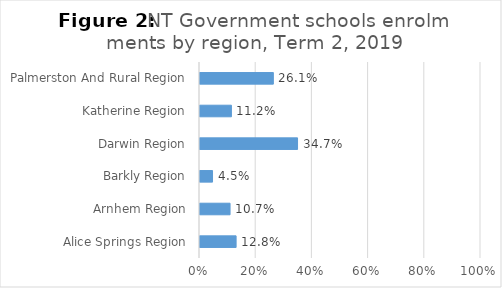
| Category | Term 2 Enrolment |
|---|---|
| Alice Springs Region | 0.128 |
| Arnhem Region | 0.107 |
| Barkly Region | 0.045 |
| Darwin Region | 0.347 |
| Katherine Region | 0.112 |
| Palmerston And Rural Region | 0.261 |